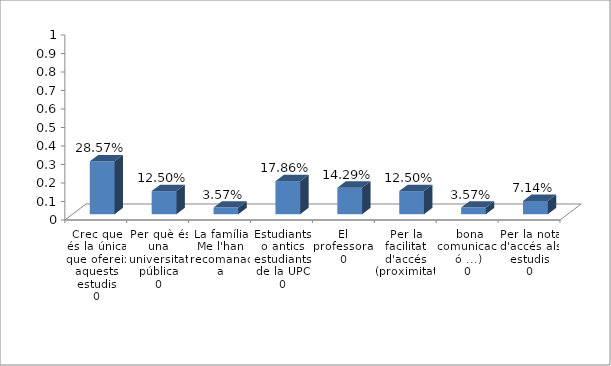
| Category | Series 0 |
|---|---|
| 0 | 0.286 |
| 1 | 0.125 |
| 2 | 0.036 |
| 3 | 0.179 |
| 4 | 0.143 |
| 5 | 0.125 |
| 6 | 0.036 |
| 7 | 0.071 |